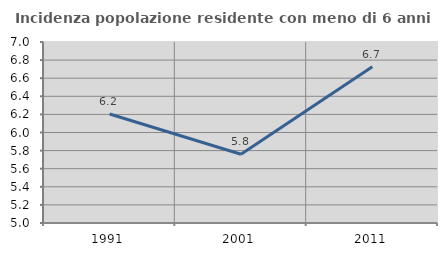
| Category | Incidenza popolazione residente con meno di 6 anni |
|---|---|
| 1991.0 | 6.204 |
| 2001.0 | 5.76 |
| 2011.0 | 6.728 |